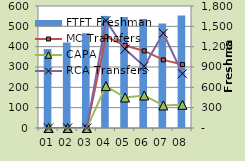
| Category | FTFT Freshman |
|---|---|
| 01 | 1165 |
| 02 | 1261 |
| 03 | 1399 |
| 04 | 1654 |
| 05 | 1638 |
| 06 | 1609 |
| 07 | 1540 |
| 08 | 1659 |